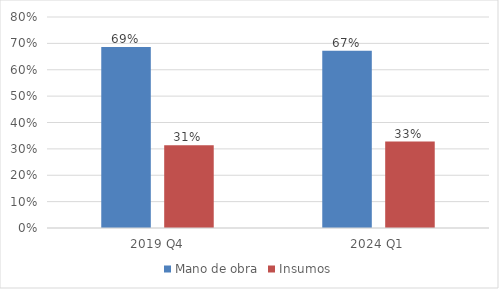
| Category | Mano de obra | Insumos |
|---|---|---|
| 2019 Q4 | 0.686 | 0.314 |
| 2024 Q1 | 0.672 | 0.328 |